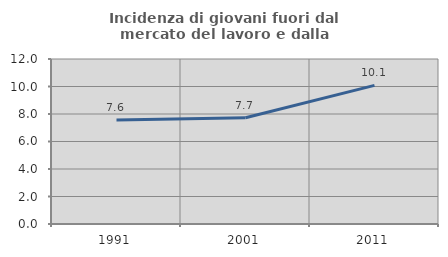
| Category | Incidenza di giovani fuori dal mercato del lavoro e dalla formazione  |
|---|---|
| 1991.0 | 7.565 |
| 2001.0 | 7.731 |
| 2011.0 | 10.084 |